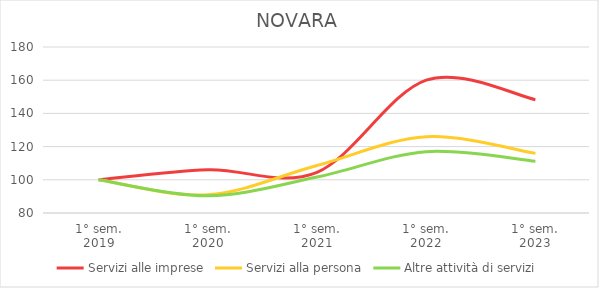
| Category | Servizi alle imprese | Servizi alla persona | Altre attività di servizi |
|---|---|---|---|
| 1° sem.
2019 | 100 | 100 | 100 |
| 1° sem.
2020 | 106.069 | 90.963 | 90.335 |
| 1° sem.
2021 | 104.514 | 108.606 | 101.647 |
| 1° sem.
2022 | 160.06 | 125.931 | 116.914 |
| 1° sem.
2023 | 148.281 | 115.917 | 111.148 |